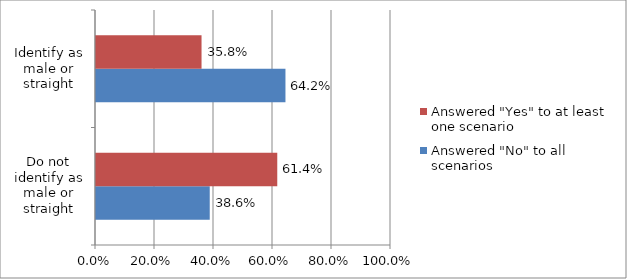
| Category | Answered "No" to all scenarios | Answered "Yes" to at least one scenario |
|---|---|---|
| Do not identify as male or straight | 0.386 | 0.614 |
| Identify as male or straight | 0.642 | 0.358 |